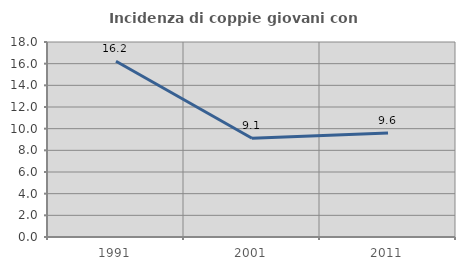
| Category | Incidenza di coppie giovani con figli |
|---|---|
| 1991.0 | 16.224 |
| 2001.0 | 9.119 |
| 2011.0 | 9.593 |